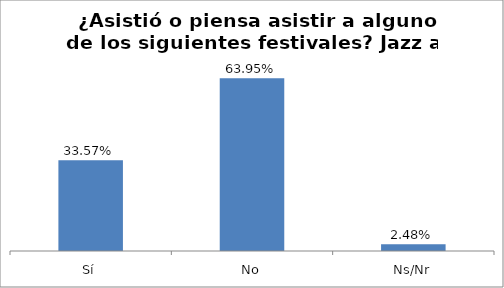
| Category | Total |
|---|---|
| Sí | 0.336 |
| No | 0.64 |
| Ns/Nr | 0.025 |